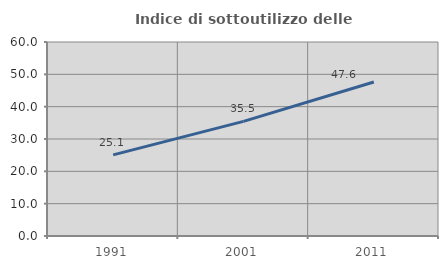
| Category | Indice di sottoutilizzo delle abitazioni  |
|---|---|
| 1991.0 | 25.077 |
| 2001.0 | 35.456 |
| 2011.0 | 47.645 |